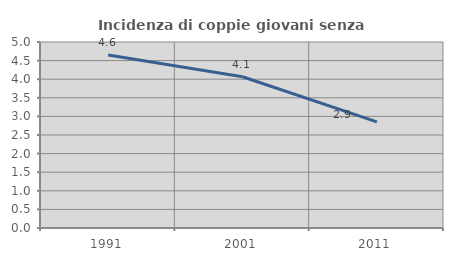
| Category | Incidenza di coppie giovani senza figli |
|---|---|
| 1991.0 | 4.649 |
| 2001.0 | 4.065 |
| 2011.0 | 2.852 |